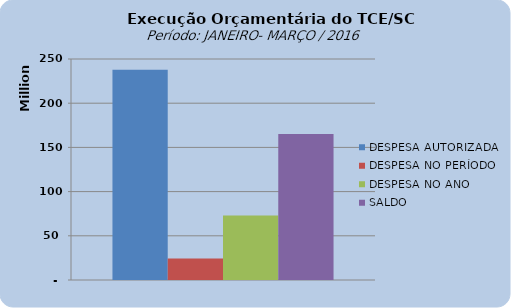
| Category | DESPESA AUTORIZADA | DESPESA NO PERÍODO | DESPESA NO ANO | SALDO |
|---|---|---|---|---|
| 0 | 237954808.56 | 24357815.08 | 72854725.82 | 165100082.74 |